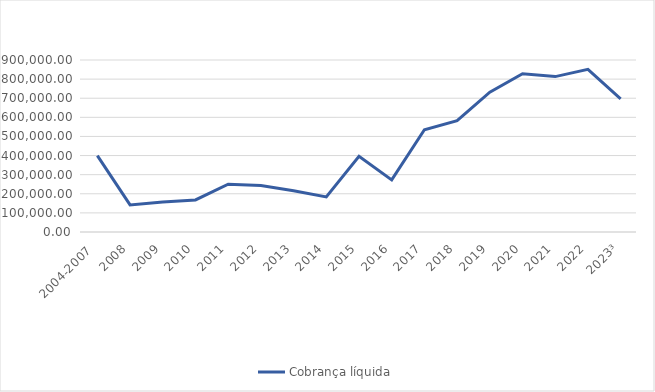
| Category | Cobrança líquida |
|---|---|
| 2004-2007  | 399358.93 |
| 2008 | 141844.99 |
| 2009 | 156651.51 |
| 2010 | 167599.65 |
| 2011 | 250133.65 |
| 2012 | 243361.67 |
| 2013 | 215485.51 |
| 2014 | 183316.46 |
| 2015 | 396466.92 |
| 2016 | 272782.12 |
| 2017 | 534750.54 |
| 2018 | 582548.07 |
| 2019 | 731919.56 |
| 2020 | 827918.85 |
| 2021 | 813131.59 |
| 2022 | 851258.37 |
| 2023³ | 696829.19 |